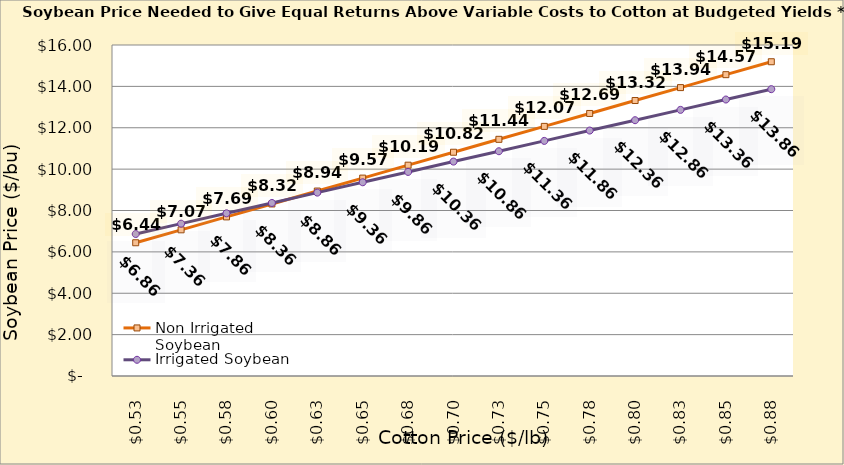
| Category | Non Irrigated Soybean | Irrigated Soybean |
|---|---|---|
| 0.5249999999999998 | 6.441 | 6.864 |
| 0.5499999999999998 | 7.066 | 7.364 |
| 0.5749999999999998 | 7.691 | 7.864 |
| 0.5999999999999999 | 8.316 | 8.364 |
| 0.6249999999999999 | 8.941 | 8.864 |
| 0.6499999999999999 | 9.566 | 9.364 |
| 0.6749999999999999 | 10.191 | 9.864 |
| 0.7 | 10.816 | 10.364 |
| 0.725 | 11.441 | 10.864 |
| 0.75 | 12.066 | 11.364 |
| 0.775 | 12.691 | 11.864 |
| 0.8 | 13.316 | 12.364 |
| 0.8250000000000001 | 13.941 | 12.864 |
| 0.8500000000000001 | 14.566 | 13.364 |
| 0.8750000000000001 | 15.191 | 13.864 |